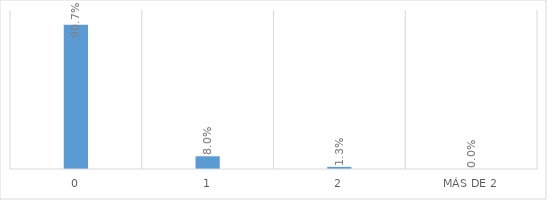
| Category | Series 0 |
|---|---|
| 0 | 0.907 |
| 1 | 0.08 |
| 2 | 0.013 |
| Más de 2 | 0 |